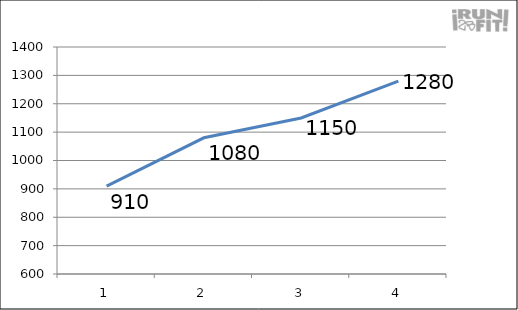
| Category | Series 0 |
|---|---|
| 0 | 910 |
| 1 | 1080 |
| 2 | 1150 |
| 3 | 1280 |